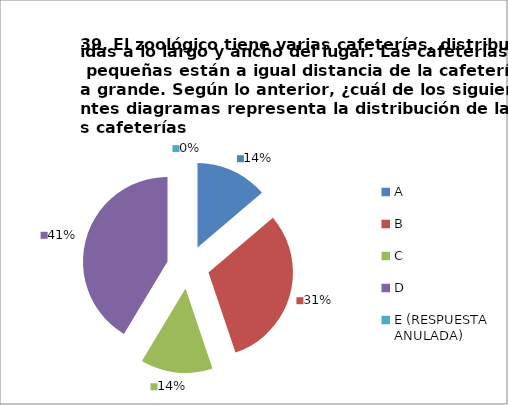
| Category | CANTIDAD DE RESPUESTAS PREGUNTA (39) | PORCENTAJE |
|---|---|---|
| A | 4 | 0.138 |
| B | 9 | 0.31 |
| C | 4 | 0.138 |
| D | 12 | 0.414 |
| E (RESPUESTA ANULADA) | 0 | 0 |